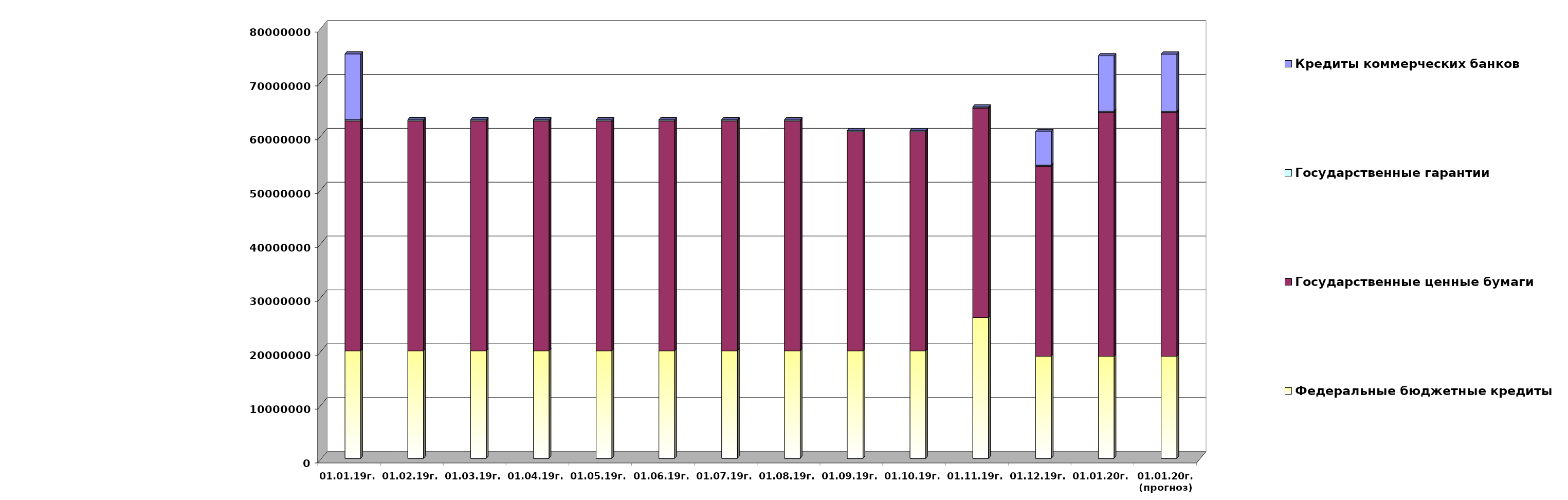
| Category | Федеральные бюджетные кредиты | Государственные ценные бумаги  | Государственные гарантии | Кредиты коммерческих банков |
|---|---|---|---|---|
| 01.01.19г. | 19957026.213 | 42700000 | 209872.86 | 12219963.75 |
| 01.02.19г. | 19957026.213 | 42700000 | 200735.86 | 0 |
| 01.03.19г. | 19957026.213 | 42700000 | 200735.86 | 0 |
| 01.04.19г. | 19957026.213 | 42700000 | 200735.86 | 0 |
| 01.05.19г. | 19957026.213 | 42700000 | 200735.86 | 0 |
| 01.06.19г. | 19957026.213 | 42700000 | 200735.86 | 0 |
| 01.07.19г. | 19957026.213 | 42700000 | 200735.86 | 0 |
| 01.08.19г. | 19957026.213 | 42700000 | 187793.375 | 0 |
| 01.09.19г. | 19957026.213 | 40700000 | 187793.375 | 0 |
| 01.10.19г. | 19957026.213 | 40700000 | 187793.375 | 0 |
| 01.11.19г. | 26148203.213 | 38900000 | 186330.02 | 0 |
| 01.12.19г. | 18954967.463 | 35300000 | 186330.02 | 6191177 |
| 01.01.20г. | 18954967.463 | 45300000 | 186330.02 | 10291177 |
| 01.01.20г.
(прогноз) | 18954967.4 | 45300000 | 176330 | 10616393.4 |